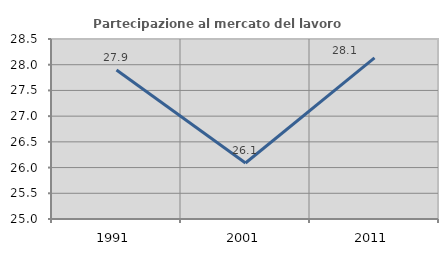
| Category | Partecipazione al mercato del lavoro  femminile |
|---|---|
| 1991.0 | 27.897 |
| 2001.0 | 26.089 |
| 2011.0 | 28.132 |